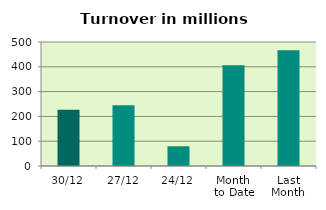
| Category | Series 0 |
|---|---|
| 30/12 | 226.494 |
| 27/12 | 245.161 |
| 24/12 | 79.488 |
| Month 
to Date | 406.107 |
| Last
Month | 466.544 |